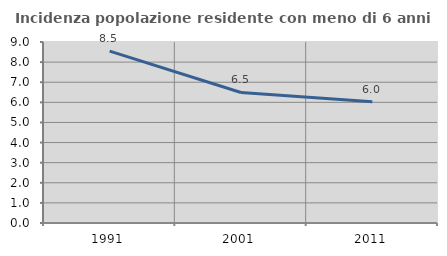
| Category | Incidenza popolazione residente con meno di 6 anni |
|---|---|
| 1991.0 | 8.545 |
| 2001.0 | 6.489 |
| 2011.0 | 6.034 |